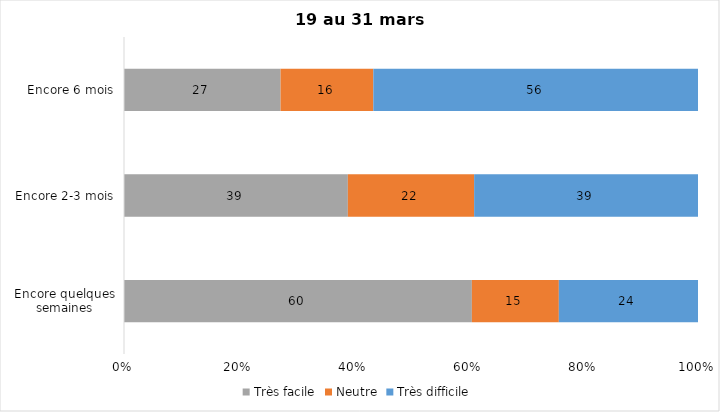
| Category | Très facile | Neutre | Très difficile |
|---|---|---|---|
| Encore quelques semaines | 60 | 15 | 24 |
| Encore 2-3 mois | 39 | 22 | 39 |
| Encore 6 mois | 27 | 16 | 56 |